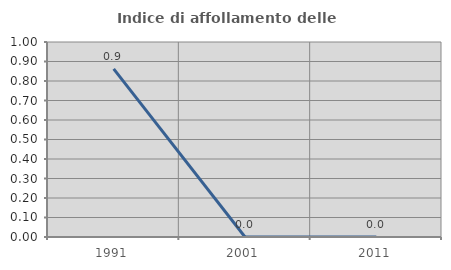
| Category | Indice di affollamento delle abitazioni  |
|---|---|
| 1991.0 | 0.862 |
| 2001.0 | 0 |
| 2011.0 | 0 |